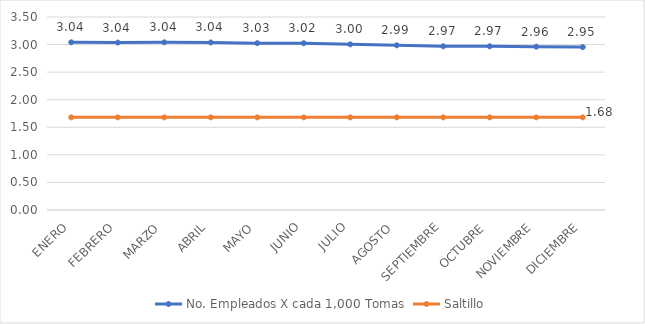
| Category | No. Empleados X cada 1,000 Tomas | Saltillo |
|---|---|---|
| ENERO | 3.041 | 1.68 |
| FEBRERO | 3.036 | 1.68 |
| MARZO | 3.041 | 1.68 |
| ABRIL | 3.038 | 1.68 |
| MAYO | 3.026 | 1.68 |
| JUNIO | 3.024 | 1.68 |
| JULIO | 3.005 | 1.68 |
| AGOSTO | 2.987 | 1.68 |
| SEPTIEMBRE | 2.969 | 1.68 |
| OCTUBRE | 2.969 | 1.68 |
| NOVIEMBRE | 2.962 | 1.68 |
| DICIEMBRE | 2.954 | 1.68 |